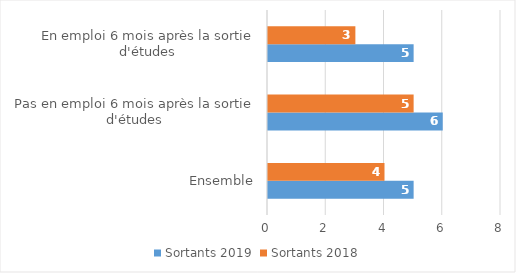
| Category | Sortants 2019 | Sortants 2018 |
|---|---|---|
| Ensemble | 5 | 4 |
| Pas en emploi 6 mois après la sortie d'études | 6 | 5 |
| En emploi 6 mois après la sortie d'études | 5 | 3 |